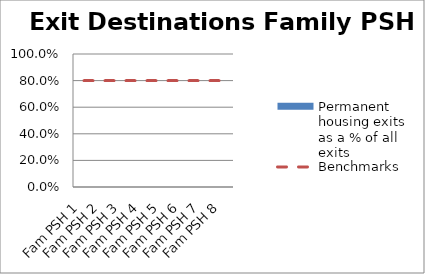
| Category | Permanent housing exits as a % of all exits |
|---|---|
| Fam PSH 1 | 0 |
| Fam PSH 2 | 0 |
| Fam PSH 3 | 0 |
| Fam PSH 4 | 0 |
| Fam PSH 5 | 0 |
| Fam PSH 6 | 0 |
| Fam PSH 7 | 0 |
| Fam PSH 8 | 0 |